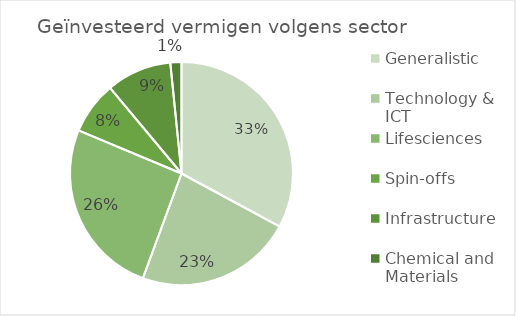
| Category | Series 0 |
|---|---|
| Generalistic | 51.2 |
| Technology & ICT | 35.4 |
| Lifesciences | 39.99 |
| Spin-offs | 11.859 |
| Infrastructure | 14.739 |
| Chemical and Materials | 2.5 |